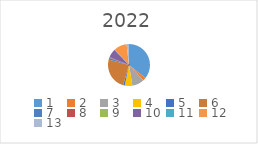
| Category | Series 0 |
|---|---|
| 1.0 | 924340.87 |
| 2.0 | 59210.43 |
| 3.0 | 244900 |
| 4.0 | 151072.01 |
| 5.0 | 33527.27 |
| 6.0 | 637841.72 |
| 7.0 | 35954 |
| 8.0 | 12183.17 |
| 9.0 | 2190 |
| 10.0 | 174836.39 |
| 11.0 | 4567 |
| 12.0 | 262946.41 |
| 13.0 | 48050.93 |